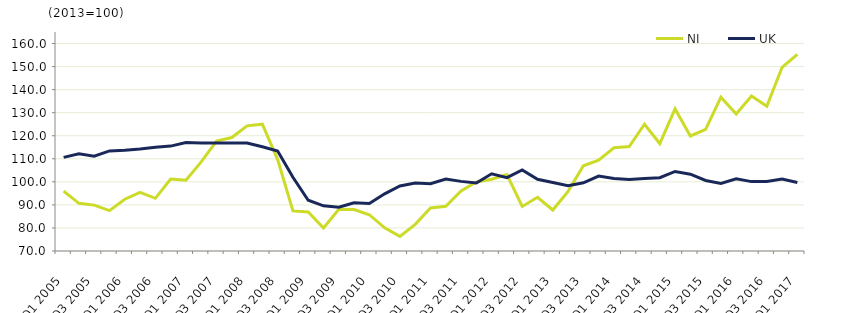
| Category | NI  | UK  |
|---|---|---|
| Q1 2005 | 95.947 | 110.6 |
| Q2 2005 | 90.679 | 112.2 |
| Q3 2005 | 89.909 | 111.1 |
| Q4 2005 | 87.508 | 113.4 |
| Q1 2006 | 92.447 | 113.7 |
| Q2 2006 | 95.425 | 114.2 |
| Q3 2006 | 92.852 | 115 |
| Q4 2006 | 101.185 | 115.5 |
| Q1 2007 | 100.732 | 117.1 |
| Q2 2007 | 108.644 | 116.9 |
| Q3 2007 | 117.676 | 116.9 |
| Q4 2007 | 119.216 | 116.9 |
| Q1 2008 | 124.285 | 116.8 |
| Q2 2008 | 125.028 | 115.2 |
| Q3 2008 | 109.633 | 113.4 |
| Q4 2008 | 87.38 | 102 |
| Q1 2009 | 86.924 | 92 |
| Q2 2009 | 79.96 | 89.6 |
| Q3 2009 | 88.083 | 89 |
| Q4 2009 | 87.953 | 90.9 |
| Q1 2010 | 85.737 | 90.6 |
| Q2 2010 | 80.058 | 94.8 |
| Q3 2010 | 76.352 | 98.2 |
| Q4 2010 | 81.568 | 99.5 |
| Q1 2011 | 88.652 | 99.2 |
| Q2 2011 | 89.428 | 101.2 |
| Q3 2011 | 96.094 | 100.2 |
| Q4 2011 | 99.949 | 99.5 |
| Q1 2012 | 101.146 | 103.5 |
| Q2 2012 | 103.19 | 101.8 |
| Q3 2012 | 89.309 | 105.2 |
| Q4 2012 | 93.283 | 101.1 |
| Q1 2013 | 87.777 | 99.7 |
| Q2 2013 | 95.867 | 98.3 |
| Q3 2013 | 106.971 | 99.6 |
| Q4 2013 | 109.384 | 102.5 |
| Q1 2014 | 114.79 | 101.5 |
| Q2 2014 | 115.313 | 101 |
| Q3 2014 | 124.99 | 101.5 |
| Q4 2014 | 116.627 | 101.8 |
| Q1 2015 | 131.646 | 104.5 |
| Q2 2015 | 119.894 | 103.3 |
| Q3 2015 | 122.725 | 100.6 |
| Q4 2015 | 136.721 | 99.3 |
| Q1 2016 | 129.476 | 101.3 |
| Q2 2016 | 137.252 | 100.1 |
| Q3 2016 | 132.772 | 100.2 |
| Q4 2016 | 149.624 | 101.2 |
| Q1 2017 | 155.253 | 99.7 |